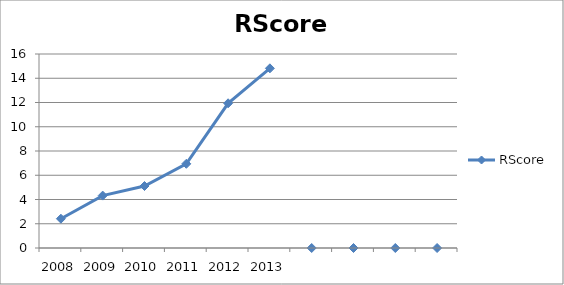
| Category | RScore |
|---|---|
| 2008.0 | 2.415 |
| 2009.0 | 4.322 |
| 2010.0 | 5.113 |
| 2011.0 | 6.944 |
| 2012.0 | 11.935 |
| 2013.0 | 14.818 |